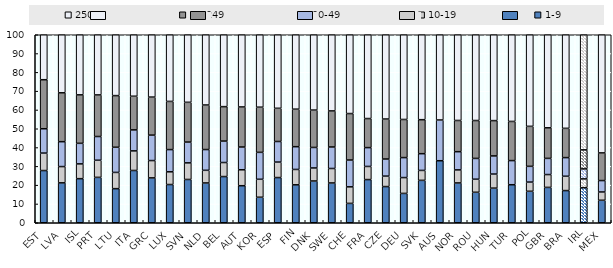
| Category | 1-9 | 10-19 | 20-49 | 50-249 | 250+ |
|---|---|---|---|---|---|
| EST | 27.768 | 9.284 | 12.955 | 26.076 | 23.916 |
| LVA | 21.227 | 8.655 | 13.239 | 25.999 | 30.881 |
| ISL | 23.448 | 7.867 | 10.937 | 25.779 | 31.968 |
| PRT | 24.139 | 9.112 | 12.62 | 22.123 | 32.006 |
| LTU | 18.143 | 8.635 | 13.385 | 27.472 | 32.365 |
| ITA | 27.808 | 10.422 | 11.17 | 17.901 | 32.7 |
| GRC | 23.862 | 9.217 | 13.536 | 20.232 | 33.154 |
| LUX | 20.334 | 6.765 | 11.815 | 25.633 | 35.453 |
| SVN | 23.023 | 8.833 | 11.056 | 21.156 | 35.931 |
| NLD | 21.166 | 6.734 | 11.043 | 23.691 | 37.366 |
| BEL | 24.575 | 7.46 | 11.415 | 18.31 | 38.239 |
| AUT | 19.7 | 8.477 | 12.11 | 21.308 | 38.405 |
| KOR | 13.566 | 9.563 | 14.315 | 24.029 | 38.528 |
| ESP | 24.043 | 8.232 | 10.95 | 17.66 | 39.116 |
| FIN | 20.179 | 8.171 | 12.109 | 19.96 | 39.581 |
| DNK | 22.215 | 6.93 | 10.909 | 19.882 | 40.065 |
| SWE | 21.166 | 7.695 | 11.445 | 19.182 | 40.512 |
| CHE | 10.301 | 8.8 | 14.262 | 24.726 | 41.911 |
| FRA | 22.967 | 6.982 | 10.027 | 15.459 | 44.565 |
| CZE | 19.243 | 5.56 | 9.097 | 21.272 | 44.828 |
| DEU | 15.606 | 8.423 | 10.635 | 20.279 | 45.057 |
| SVK | 22.553 | 5.282 | 8.903 | 18.083 | 45.179 |
| AUS | 32.992 | 0 | 21.664 | 0 | 45.345 |
| NOR | 21.176 | 6.939 | 9.69 | 16.606 | 45.589 |
| ROU | 16.209 | 6.95 | 11.059 | 20.164 | 45.618 |
| HUN | 18.414 | 7.484 | 9.657 | 18.779 | 45.666 |
| TUR | 20.222 | 0 | 12.842 | 20.827 | 46.109 |
| POL | 16.741 | 4.888 | 8.38 | 21.279 | 48.712 |
| GBR | 18.801 | 6.834 | 8.605 | 16.262 | 49.498 |
| BRA | 17.12 | 7.62 | 9.916 | 15.566 | 49.778 |
| IRL | 18.635 | 4.697 | 5.297 | 10.137 | 61.233 |
| MEX | 11.952 | 4.414 | 6.077 | 14.709 | 62.848 |